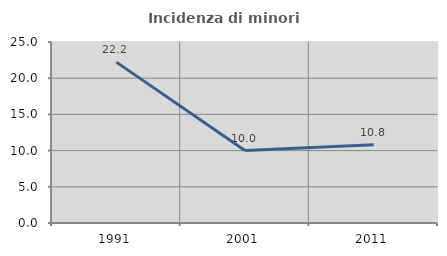
| Category | Incidenza di minori stranieri |
|---|---|
| 1991.0 | 22.222 |
| 2001.0 | 10 |
| 2011.0 | 10.811 |